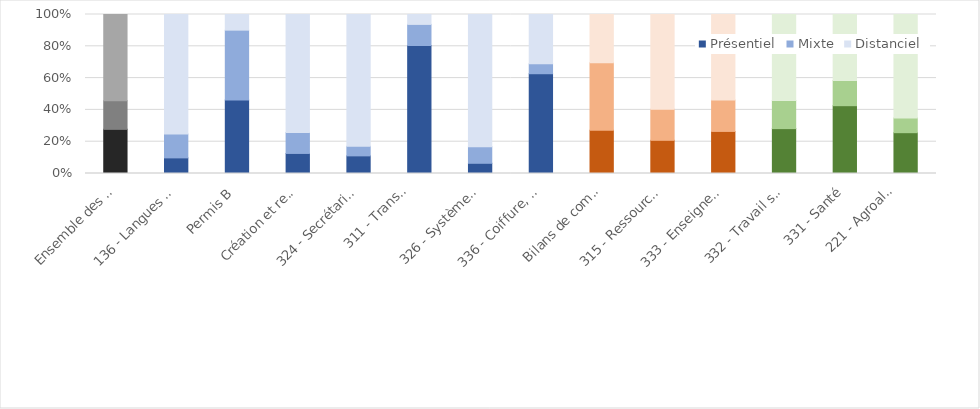
| Category | Présentiel | Mixte | Distanciel |
|---|---|---|---|
| Ensemble des formations | 0.278 | 0.18 | 0.542 |
| 136 - Langues vivantes | 0.098 | 0.15 | 0.752 |
| Permis B | 0.463 | 0.439 | 0.098 |
| Création et reprise d'entreprise | 0.126 | 0.132 | 0.742 |
| 324 - Secrétariat, bureautique | 0.111 | 0.06 | 0.829 |
| 311 - Transport (hors permis B),
manutention, magasinage | 0.805 | 0.133 | 0.062 |
| 326 - Systèmes d'information | 0.064 | 0.104 | 0.832 |
| 336 - Coiffure, esthétique | 0.628 | 0.062 | 0.31 |
| Bilans de compétences | 0.272 | 0.425 | 0.303 |
| 315 - Ressources humaines | 0.209 | 0.196 | 0.596 |
| 333 - Enseignement, formation | 0.265 | 0.197 | 0.538 |
| 332 - Travail social | 0.282 | 0.177 | 0.541 |
| 331 - Santé | 0.426 | 0.159 | 0.415 |
| 221 - Agroalimentaire,
alimentation, cuisine | 0.257 | 0.093 | 0.651 |